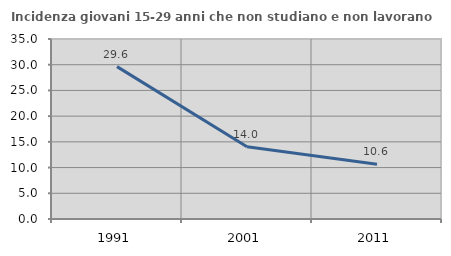
| Category | Incidenza giovani 15-29 anni che non studiano e non lavorano  |
|---|---|
| 1991.0 | 29.63 |
| 2001.0 | 14.035 |
| 2011.0 | 10.638 |